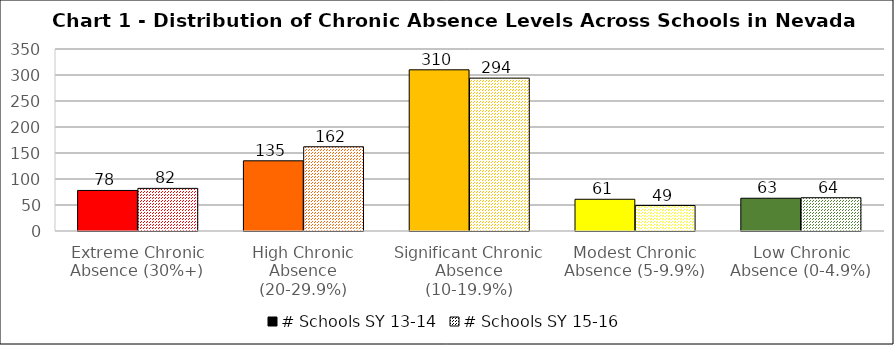
| Category | # Schools SY 13-14 | # Schools SY 15-16 |
|---|---|---|
| Extreme Chronic Absence (30%+) | 78 | 82 |
| High Chronic Absence (20-29.9%) | 135 | 162 |
| Significant Chronic Absence (10-19.9%) | 310 | 294 |
| Modest Chronic Absence (5-9.9%) | 61 | 49 |
| Low Chronic Absence (0-4.9%) | 63 | 64 |